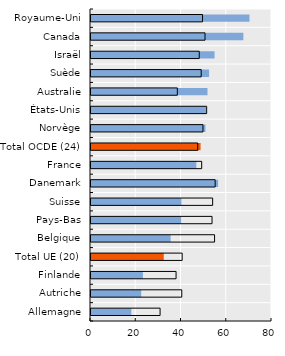
| Category | Nés dans le pays de deux parents immigrés | Nés dans le pays de deux parents nés dans le pays |
|---|---|---|
| Allemagne | 17.825 | 30.537 |
| Autriche | 22.201 | 40.124 |
| Finlande | 22.945 | 37.602 |
| Total UE (20) | 32.149 | 40.296 |
| Belgique | 35.198 | 54.619 |
| Pays-Bas | 39.831 | 53.497 |
| Suisse | 39.948 | 53.765 |
| Danemark | 56.19 | 54.879 |
| France | 46.545 | 48.925 |
| Total OCDE (24) | 48.433 | 47.181 |
| Norvège | 50.579 | 49.476 |
| États-Unis | 50.824 | 51.123 |
| Australie | 51.492 | 38.156 |
| Suède | 52.198 | 48.712 |
| Israël | 54.613 | 47.85 |
| Canada | 67.346 | 50.397 |
| Royaume-Uni | 70.042 | 49.292 |